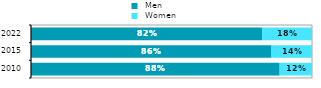
| Category |  Men |  Women |
|---|---|---|
| 2010.0 | 0.885 | 0.115 |
| 2015.0 | 0.856 | 0.144 |
| 2022.0 | 0.822 | 0.178 |